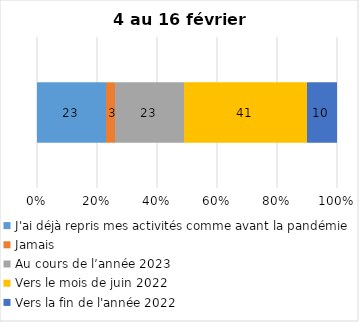
| Category | J'ai déjà repris mes activités comme avant la pandémie | Jamais | Au cours de l’année 2023 | Vers le mois de juin 2022 | Vers la fin de l'année 2022 |
|---|---|---|---|---|---|
| 0 | 23 | 3 | 23 | 41 | 10 |